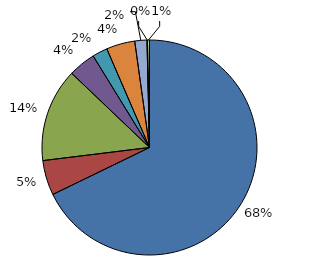
| Category | DIHR |
|---|---|
| Eau | 1241420672 |
| Aménagement de Zones, Lotissement, Ateliers | 96078003 |
| Économie | 257512592 |
| Tourisme-Culture-Sport | 75106426 |
| Santé-Social | 41845463 |
| Scolaire | 78628944 |
| Transport | 33426585 |
| Ordures | 1313470 |
| Administration | 5579430 |